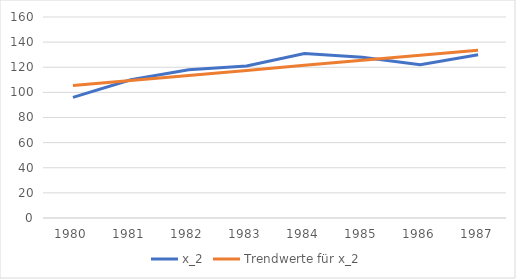
| Category | x_2 | Trendwerte für x_2 |
|---|---|---|
| 1980.0 | 96 | 105.417 |
| 1981.0 | 110 | 109.44 |
| 1982.0 | 118 | 113.464 |
| 1983.0 | 121 | 117.488 |
| 1984.0 | 131 | 121.512 |
| 1985.0 | 128 | 125.536 |
| 1986.0 | 122 | 129.56 |
| 1987.0 | 130 | 133.583 |